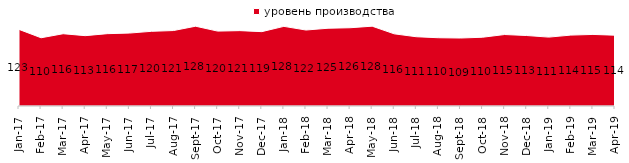
| Category | уровень производства |
|---|---|
| 2017-01-01 | 122.95 |
| 2017-02-01 | 109.5 |
| 2017-03-01 | 116 |
| 2017-04-01 | 112.9 |
| 2017-05-01 | 116.1 |
| 2017-06-01 | 117.05 |
| 2017-07-01 | 119.85 |
| 2017-08-01 | 121.1 |
| 2017-09-01 | 128.05 |
| 2017-10-01 | 120.2 |
| 2017-11-01 | 120.95 |
| 2017-12-01 | 119.35 |
| 2018-01-01 | 127.8 |
| 2018-02-01 | 121.95 |
| 2018-03-01 | 124.8 |
| 2018-04-01 | 125.6 |
| 2018-05-01 | 128.1 |
| 2018-06-01 | 115.8 |
| 2018-07-01 | 111.15 |
| 2018-08-01 | 109.55 |
| 2018-09-01 | 109.1 |
| 2018-10-01 | 110.35 |
| 2018-11-01 | 114.721 |
| 2018-12-01 | 113.1 |
| 2019-01-01 | 110.55 |
| 2019-02-01 | 113.8 |
| 2019-03-01 | 114.868 |
| 2019-04-01 | 113.663 |